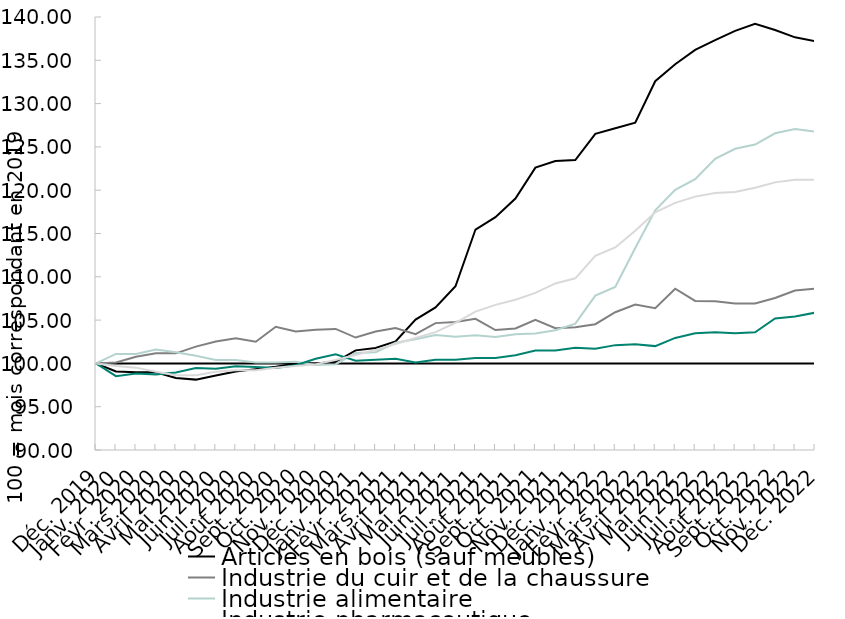
| Category | 100 ligne horizontale | Articles en bois (sauf meubles) | Industrie du cuir et de la chaussure | Industrie alimentaire | Industrie pharmaceutique | Total industrie |
|---|---|---|---|---|---|---|
| Déc. 2019 | 100 | 100 | 100 | 100 | 100 | 100 |
| Janv. 2020 | 100 | 99.06 | 100.096 | 101.09 | 98.523 | 99.706 |
| Févr. 2020 | 100 | 98.966 | 100.775 | 101.09 | 98.84 | 99.511 |
| Mars 2020 | 100 | 98.967 | 101.165 | 101.59 | 98.733 | 99.024 |
| Avril 2020 | 100 | 98.315 | 101.161 | 101.291 | 98.95 | 98.635 |
| Mai 2020 | 100 | 98.127 | 101.938 | 100.893 | 99.474 | 98.634 |
| Juin 2020 | 100 | 98.593 | 102.534 | 100.396 | 99.369 | 99.022 |
| Juil. 2020 | 100 | 99.057 | 102.913 | 100.395 | 99.684 | 99.216 |
| Août 2020 | 100 | 99.34 | 102.5 | 100.099 | 99.578 | 99.216 |
| Sept. 2020 | 100 | 99.621 | 104.231 | 100.099 | 99.472 | 99.51 |
| Oct. 2020 | 100 | 100 | 103.679 | 100.197 | 99.788 | 99.706 |
| Nov. 2020 | 100 | 100 | 103.872 | 99.804 | 100.531 | 99.902 |
| Déc. 2020 | 100 | 100.189 | 103.981 | 99.902 | 101.065 | 100.393 |
| Janv. 2021 | 100 | 101.504 | 102.984 | 101.189 | 100.316 | 100.978 |
| Févr. 2021 | 100 | 101.786 | 103.682 | 101.288 | 100.422 | 101.564 |
| Mars 2021 | 100 | 102.535 | 104.078 | 102.386 | 100.528 | 102.244 |
| Avril 2021 | 100 | 105.056 | 103.385 | 102.781 | 100.105 | 102.924 |
| Mai 2021 | 100 | 106.461 | 104.651 | 103.274 | 100.421 | 103.61 |
| Juin 2021 | 100 | 108.912 | 104.776 | 103.066 | 100.421 | 104.692 |
| Juil. 2021 | 100 | 115.457 | 105.146 | 103.261 | 100.632 | 105.975 |
| Août 2021 | 100 | 116.887 | 103.846 | 103.06 | 100.633 | 106.758 |
| Sept. 2021 | 100 | 119.034 | 104.038 | 103.356 | 100.95 | 107.346 |
| Oct. 2021 | 100 | 122.611 | 105.034 | 103.445 | 101.483 | 108.145 |
| Nov. 2021 | 100 | 123.368 | 104.066 | 103.824 | 101.486 | 109.234 |
| Déc. 2021 | 100 | 123.485 | 104.175 | 104.59 | 101.81 | 109.823 |
| Janv. 2022 | 100 | 126.504 | 104.524 | 107.83 | 101.688 | 112.427 |
| Févr. 2022 | 100 | 127.162 | 105.911 | 108.821 | 102.11 | 113.392 |
| Mars 2022 | 100 | 127.793 | 106.796 | 113.32 | 102.218 | 115.317 |
| Avril 2022 | 100 | 132.584 | 106.383 | 117.676 | 101.996 | 117.446 |
| Mai 2022 | 100 | 134.551 | 108.624 | 120.04 | 102.944 | 118.537 |
| Juin 2022 | 100 | 136.21 | 107.212 | 121.266 | 103.47 | 119.257 |
| Juil. 2022 | 100 | 137.323 | 107.184 | 123.617 | 103.583 | 119.687 |
| Août 2022 | 100 | 138.396 | 106.923 | 124.778 | 103.481 | 119.785 |
| Sept. 2022 | 100 | 139.205 | 106.923 | 125.271 | 103.59 | 120.274 |
| Oct. 2022 | 100 | 138.505 | 107.551 | 126.575 | 105.191 | 120.903 |
| Nov. 2022 | 100 | 137.654 | 108.422 | 127.059 | 105.414 | 121.218 |
| Déc. 2022 | 100 | 137.216 | 108.641 | 126.758 | 105.857 | 121.218 |